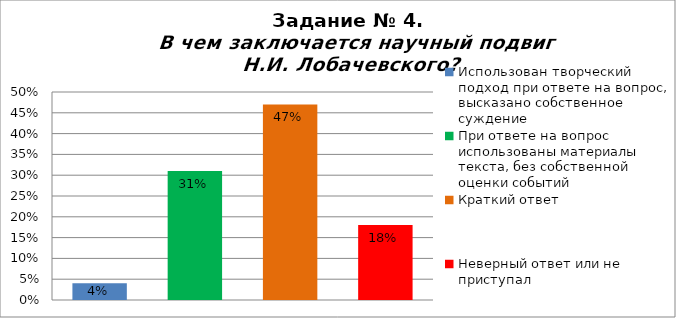
| Category | В чем заключается научный подвиг Н.И. Лобачевского? |
|---|---|
| Использован творческий подход при ответе на вопрос, высказано собственное суждение | 0.04 |
| При ответе на вопрос использованы материалы текста, без собственной оценки событий | 0.31 |
| Краткий ответ | 0.47 |
| Неверный ответ или не приступал | 0.18 |